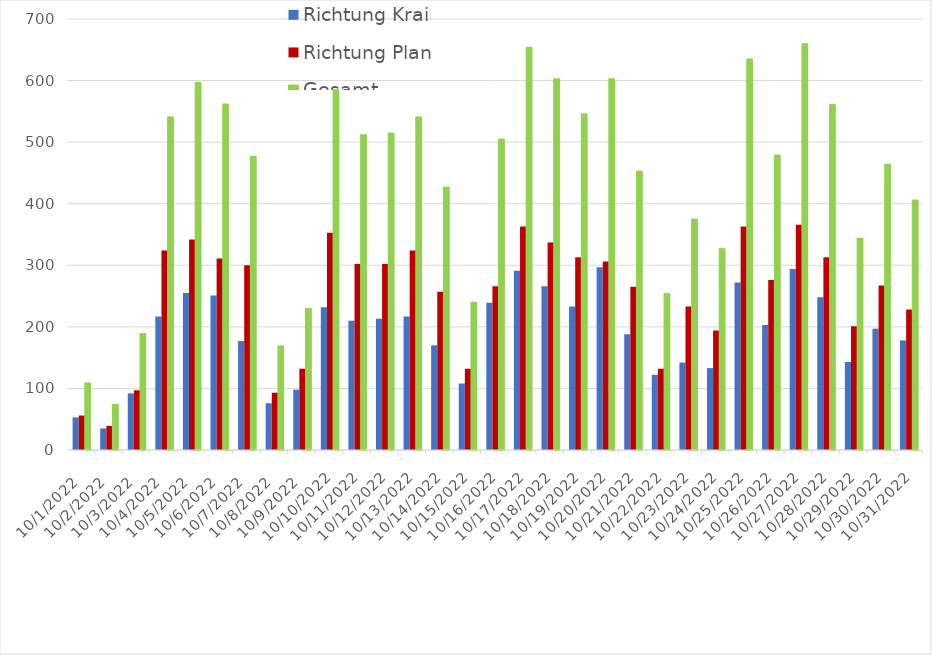
| Category | Richtung Krailling | Richtung Planegg | Gesamt |
|---|---|---|---|
| 10/1/22 | 53 | 56 | 109 |
| 10/2/22 | 35 | 39 | 74 |
| 10/3/22 | 92 | 97 | 189 |
| 10/4/22 | 217 | 324 | 541 |
| 10/5/22 | 255 | 342 | 597 |
| 10/6/22 | 251 | 311 | 562 |
| 10/7/22 | 177 | 300 | 477 |
| 10/8/22 | 76 | 93 | 169 |
| 10/9/22 | 98 | 132 | 230 |
| 10/10/22 | 232 | 353 | 585 |
| 10/11/22 | 210 | 302 | 512 |
| 10/12/22 | 213 | 302 | 515 |
| 10/13/22 | 217 | 324 | 541 |
| 10/14/22 | 170 | 257 | 427 |
| 10/15/22 | 108 | 132 | 240 |
| 10/16/22 | 239 | 266 | 505 |
| 10/17/22 | 291 | 363 | 654 |
| 10/18/22 | 266 | 337 | 603 |
| 10/19/22 | 233 | 313 | 546 |
| 10/20/22 | 297 | 306 | 603 |
| 10/21/22 | 188 | 265 | 453 |
| 10/22/22 | 122 | 132 | 254 |
| 10/23/22 | 142 | 233 | 375 |
| 10/24/22 | 133 | 194 | 327 |
| 10/25/22 | 272 | 363 | 635 |
| 10/26/22 | 203 | 276 | 479 |
| 10/27/22 | 294 | 366 | 660 |
| 10/28/22 | 248 | 313 | 561 |
| 10/29/22 | 143 | 201 | 344 |
| 10/30/22 | 197 | 267 | 464 |
| 10/31/22 | 178 | 228 | 406 |